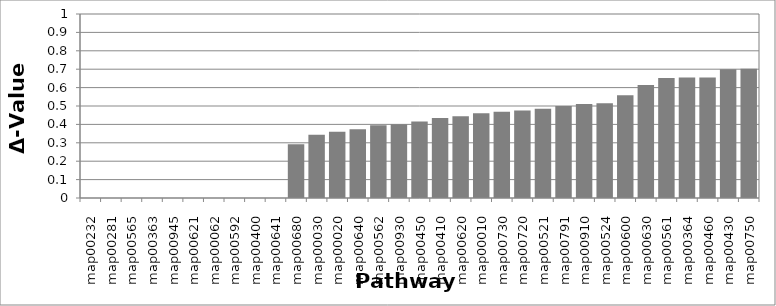
| Category | Series 0 |
|---|---|
| map00232 | 0 |
| map00281 | 0 |
| map00565 | 0 |
| map00363 | 0 |
| map00945 | 0 |
| map00621 | 0 |
| map00062 | 0 |
| map00592 | 0 |
| map00400 | 0 |
| map00641 | 0 |
| map00680 | 0.292 |
| map00030 | 0.344 |
| map00020 | 0.359 |
| map00640 | 0.374 |
| map00562 | 0.395 |
| map00930 | 0.401 |
| map00450 | 0.415 |
| map00410 | 0.435 |
| map00620 | 0.444 |
| map00010 | 0.461 |
| map00730 | 0.468 |
| map00720 | 0.476 |
| map00521 | 0.486 |
| map00791 | 0.5 |
| map00910 | 0.51 |
| map00524 | 0.515 |
| map00600 | 0.559 |
| map00630 | 0.614 |
| map00561 | 0.653 |
| map00364 | 0.655 |
| map00460 | 0.655 |
| map00430 | 0.699 |
| map00750 | 0.703 |